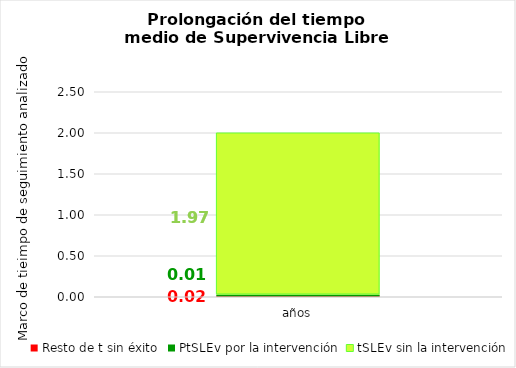
| Category | Resto de t sin éxito | PtSLEv por la intervención | tSLEv sin la intervención |
|---|---|---|---|
| años | 0.019 | 0.012 | 1.969 |